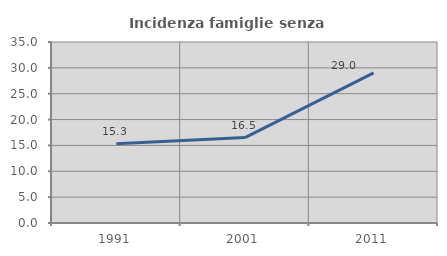
| Category | Incidenza famiglie senza nuclei |
|---|---|
| 1991.0 | 15.315 |
| 2001.0 | 16.522 |
| 2011.0 | 29.038 |